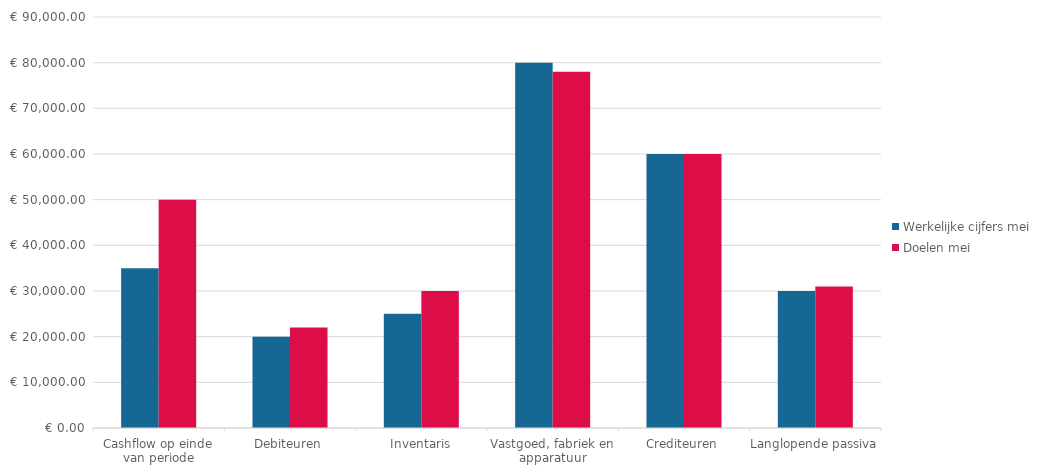
| Category | Werkelijke cijfers mei | Doelen mei |
|---|---|---|
| Cashflow op einde van periode | 35000 | 50000 |
| Debiteuren | 20000 | 22000 |
| Inventaris | 25000 | 30000 |
| Vastgoed, fabriek en apparatuur | 80000 | 78000 |
| Crediteuren | 60000 | 60000 |
| Langlopende passiva | 30000 | 31000 |